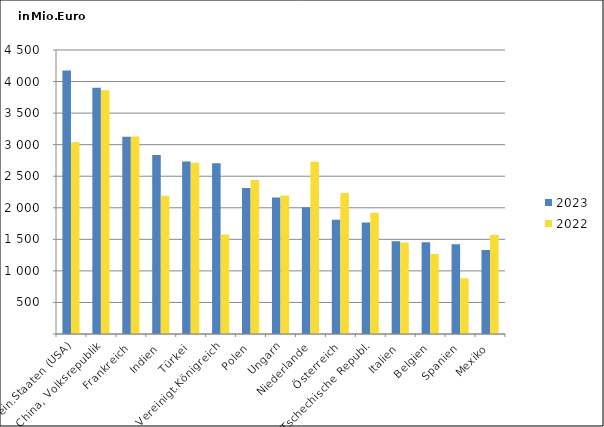
| Category | 2023 | 2022 |
|---|---|---|
| Verein.Staaten (USA) | 4176.727 | 3036.624 |
| China, Volksrepublik | 3903.035 | 3862.601 |
| Frankreich | 3125.11 | 3129.495 |
| Indien | 2838.088 | 2192.508 |
| Türkei | 2732.707 | 2712.785 |
| Vereinigt.Königreich | 2705.831 | 1575.966 |
| Polen | 2314.378 | 2439.903 |
| Ungarn | 2162.666 | 2196.303 |
| Niederlande | 2008.688 | 2728.589 |
| Österreich | 1808.972 | 2234.401 |
| Tschechische Republ. | 1767.288 | 1920.804 |
| Italien | 1469.841 | 1448.903 |
| Belgien | 1455.706 | 1268.194 |
| Spanien | 1423.083 | 882.302 |
| Mexiko | 1331.032 | 1573 |